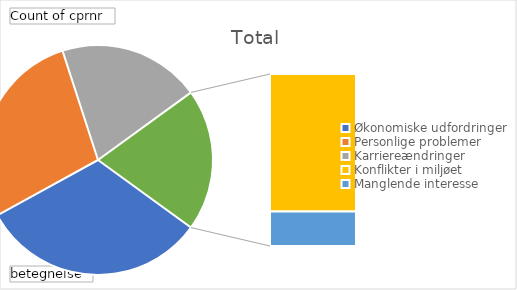
| Category | Total |
|---|---|
| Økonomiske udfordringer | 8 |
| Personlige problemer | 7 |
| Karriereændringer | 5 |
| Konflikter i miljøet | 4 |
| Manglende interesse | 1 |